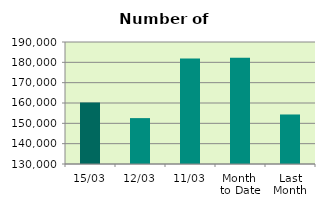
| Category | Series 0 |
|---|---|
| 15/03 | 160206 |
| 12/03 | 152570 |
| 11/03 | 181840 |
| Month 
to Date | 182264.727 |
| Last
Month | 154356.5 |